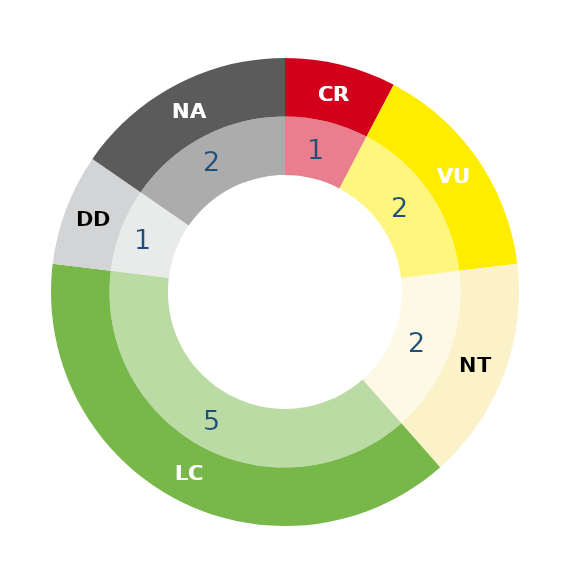
| Category | Series 1 | Series 0 |
|---|---|---|
| RE | 0 | 0 |
| CR | 1 | 1 |
| EN | 0 | 0 |
| VU | 2 | 2 |
| NT | 2 | 2 |
| LC | 5 | 5 |
| DD | 1 | 1 |
| NA | 2 | 2 |